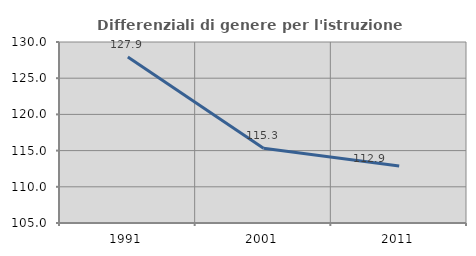
| Category | Differenziali di genere per l'istruzione superiore |
|---|---|
| 1991.0 | 127.927 |
| 2001.0 | 115.339 |
| 2011.0 | 112.875 |